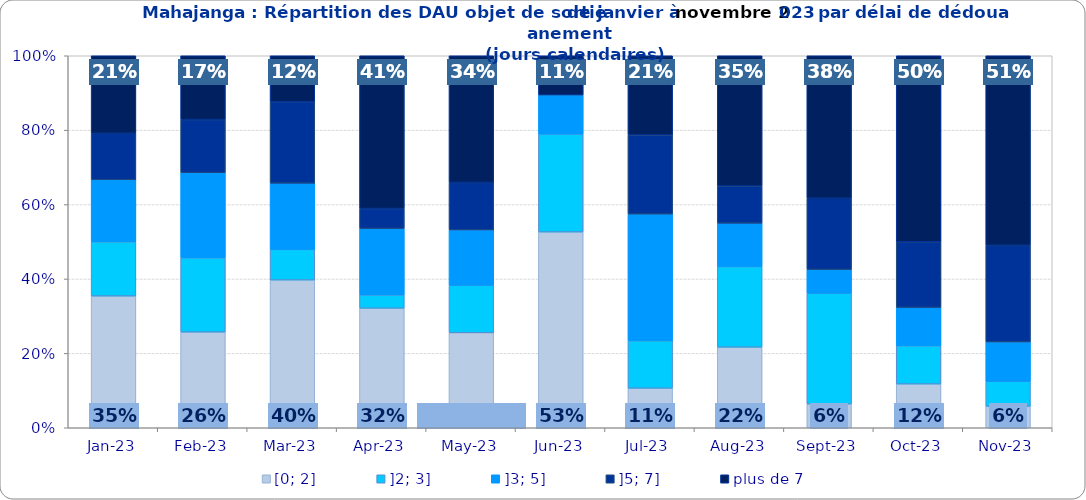
| Category | [0; 2] | ]2; 3] | ]3; 5] | ]5; 7] | plus de 7 |
|---|---|---|---|---|---|
| 2023-01-01 | 0.354 | 0.146 | 0.167 | 0.125 | 0.208 |
| 2023-02-01 | 0.257 | 0.2 | 0.229 | 0.143 | 0.171 |
| 2023-03-01 | 0.397 | 0.082 | 0.178 | 0.219 | 0.123 |
| 2023-04-01 | 0.321 | 0.036 | 0.179 | 0.054 | 0.411 |
| 2023-05-01 | 0.255 | 0.128 | 0.149 | 0.128 | 0.34 |
| 2023-06-01 | 0.526 | 0.263 | 0.105 | 0 | 0.105 |
| 2023-07-01 | 0.106 | 0.128 | 0.34 | 0.213 | 0.213 |
| 2023-08-01 | 0.217 | 0.217 | 0.117 | 0.1 | 0.35 |
| 2023-09-01 | 0.064 | 0.298 | 0.064 | 0.191 | 0.383 |
| 2023-10-01 | 0.118 | 0.103 | 0.103 | 0.176 | 0.5 |
| 2023-11-01 | 0.058 | 0.067 | 0.106 | 0.26 | 0.51 |